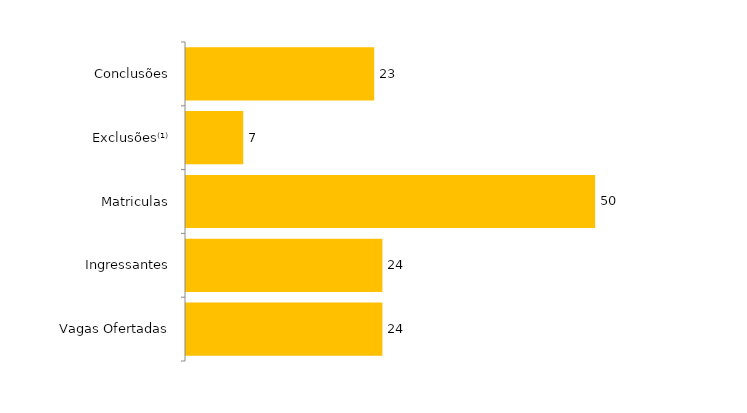
| Category | Total (2015) |
|---|---|
| Vagas Ofertadas | 24 |
| Ingressantes | 24 |
| Matriculas | 50 |
| Exclusões⁽¹⁾ | 7 |
| Conclusões | 23 |